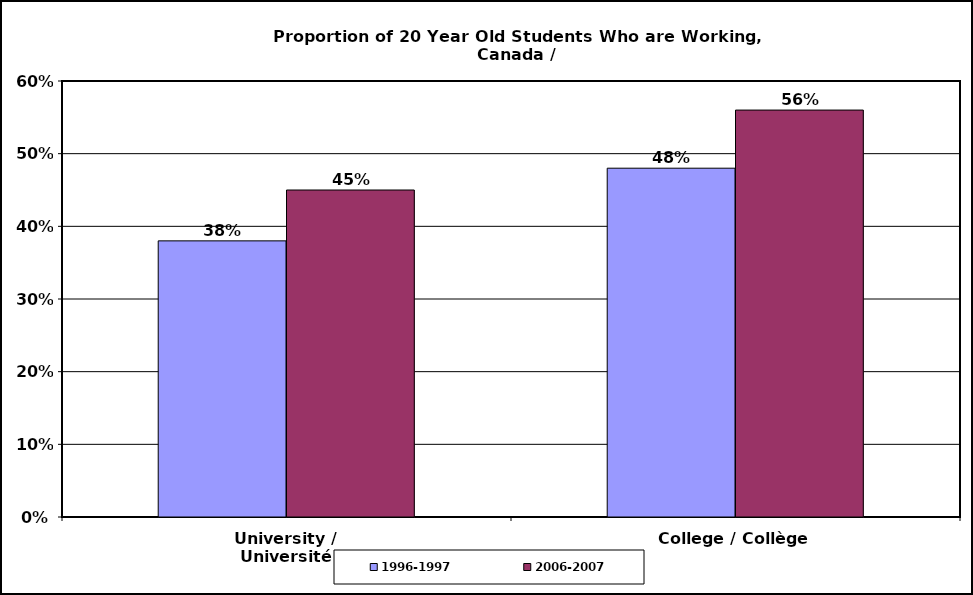
| Category | 1996-1997 | 2006-2007 |
|---|---|---|
| University / Université | 0.38 | 0.45 |
| College / Collège | 0.48 | 0.56 |